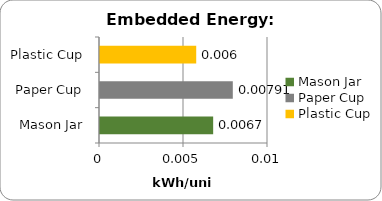
| Category | Series 0 |
|---|---|
| Mason Jar | 0.007 |
| Paper Cup | 0.008 |
| Plastic Cup | 0.006 |